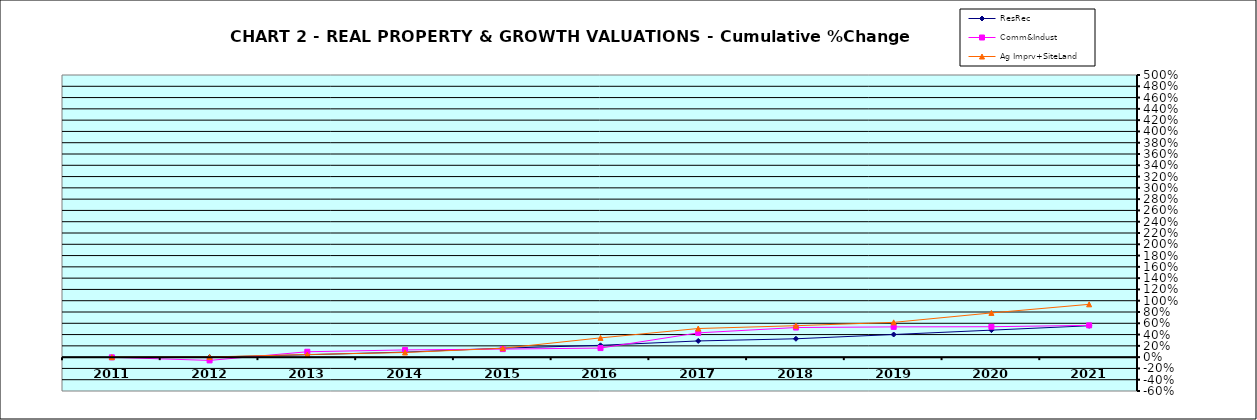
| Category | ResRec | Comm&Indust | Ag Imprv+SiteLand |
|---|---|---|---|
| 2011.0 | -0.007 | -0.003 | 0 |
| 2012.0 | 0 | -0.058 | 0.003 |
| 2013.0 | 0.043 | 0.095 | 0.046 |
| 2014.0 | 0.089 | 0.128 | 0.083 |
| 2015.0 | 0.159 | 0.142 | 0.157 |
| 2016.0 | 0.21 | 0.161 | 0.341 |
| 2017.0 | 0.287 | 0.43 | 0.507 |
| 2018.0 | 0.325 | 0.525 | 0.557 |
| 2019.0 | 0.401 | 0.536 | 0.616 |
| 2020.0 | 0.478 | 0.539 | 0.783 |
| 2021.0 | 0.556 | 0.563 | 0.936 |